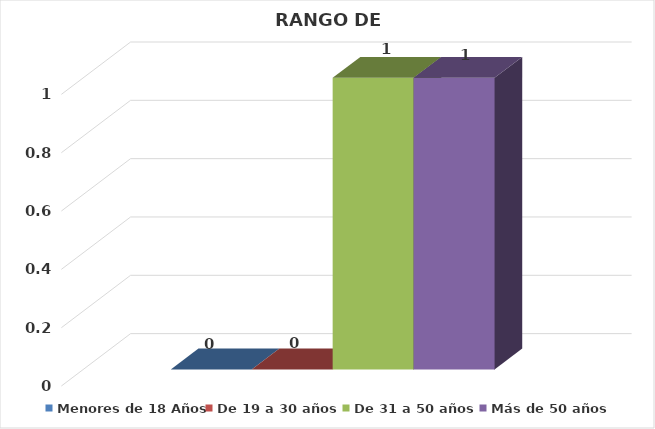
| Category | Menores de 18 Años | De 19 a 30 años  | De 31 a 50 años  | Más de 50 años  |
|---|---|---|---|---|
| 0 | 0 | 0 | 1 | 1 |